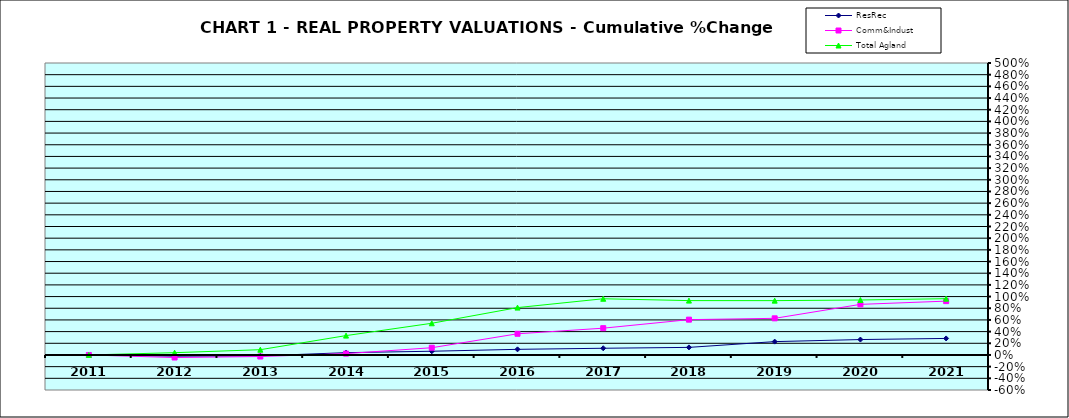
| Category | ResRec | Comm&Indust | Total Agland |
|---|---|---|---|
| 2011.0 | 0 | 0 | 0 |
| 2012.0 | -0.021 | -0.044 | 0.039 |
| 2013.0 | -0.016 | -0.027 | 0.09 |
| 2014.0 | 0.04 | 0.023 | 0.332 |
| 2015.0 | 0.064 | 0.124 | 0.543 |
| 2016.0 | 0.096 | 0.363 | 0.811 |
| 2017.0 | 0.115 | 0.459 | 0.962 |
| 2018.0 | 0.13 | 0.605 | 0.931 |
| 2019.0 | 0.228 | 0.627 | 0.93 |
| 2020.0 | 0.264 | 0.867 | 0.941 |
| 2021.0 | 0.283 | 0.922 | 0.964 |